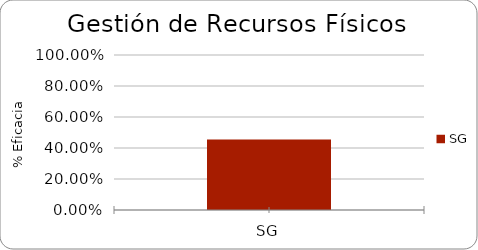
| Category | % Eficacia total |
|---|---|
| SG | 0.455 |